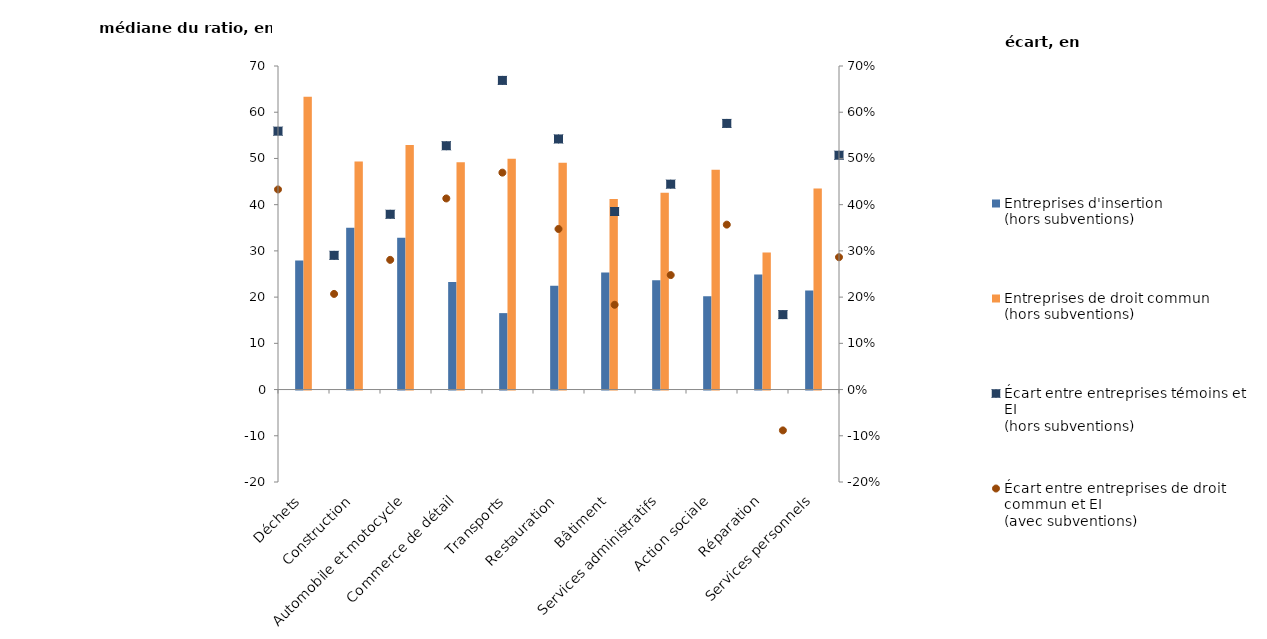
| Category | Entreprises d'insertion 
(hors subventions) | Entreprises de droit commun 
(hors subventions) |
|---|---|---|
| Déchets | 27.934 | 63.348 |
| Construction | 35 | 49.321 |
| Automobile et motocycle | 32.85 | 52.917 |
| Commerce de détail | 23.245 | 49.192 |
| Transports | 16.537 | 49.935 |
| Restauration | 22.459 | 49.057 |
| Bâtiment | 25.329 | 41.203 |
| Services administratifs | 23.658 | 42.578 |
| Action sociale | 20.183 | 47.577 |
| Réparation | 24.866 | 29.677 |
| Services personnels | 21.434 | 43.474 |